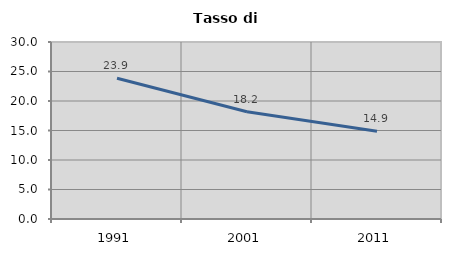
| Category | Tasso di disoccupazione   |
|---|---|
| 1991.0 | 23.865 |
| 2001.0 | 18.187 |
| 2011.0 | 14.889 |